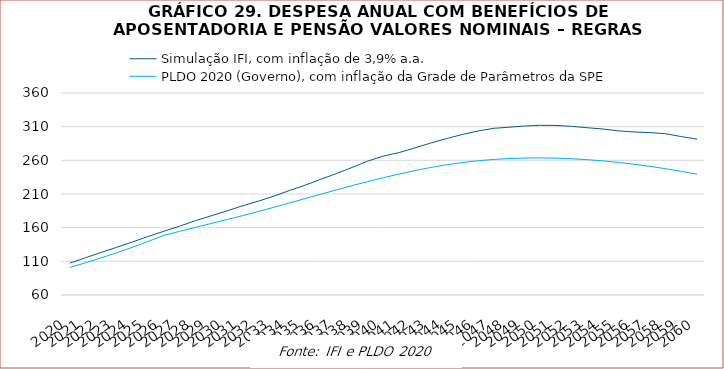
| Category | Simulação IFI, com inflação de 3,9% a.a. | PLDO 2020 (Governo), com inflação da Grade de Parâmetros da SPE |
|---|---|---|
| 2020.0 | 107351899791.775 | 100879070000 |
| 2021.0 | 115361453631.721 | 107879221000 |
| 2022.0 | 123233236311.306 | 115222703000 |
| 2023.0 | 130944334706.833 | 122827494000 |
| 2024.0 | 138782771306.719 | 130947528000 |
| 2025.0 | 146939864227.411 | 139573486000 |
| 2026.0 | 154710650795.586 | 148487649000 |
| 2027.0 | 162195067323.407 | 154557029000 |
| 2028.0 | 170308228547.678 | 160444946000 |
| 2029.0 | 177494018449.356 | 166151333000 |
| 2030.0 | 184768752678.016 | 171958755000 |
| 2031.0 | 192395012955.414 | 177766430000 |
| 2032.0 | 199144826270.896 | 183864323000 |
| 2033.0 | 206795152116.527 | 190169994000 |
| 2034.0 | 215110233084.601 | 196701173000 |
| 2035.0 | 223058993151.744 | 203153802000 |
| 2036.0 | 231825744930.687 | 209658571000 |
| 2037.0 | 240389469108.066 | 216056701000 |
| 2038.0 | 249465721070.328 | 222413553000 |
| 2039.0 | 258890132127.832 | 228466656000 |
| 2040.0 | 266304627676.107 | 234240041000 |
| 2041.0 | 271556692420.097 | 239672494000 |
| 2042.0 | 278440537884.08 | 244803575000 |
| 2043.0 | 285630151806.433 | 249335587000 |
| 2044.0 | 292162833244.225 | 253301853000 |
| 2045.0 | 298268706599.196 | 256567157000 |
| 2046.0 | 303458423956.451 | 259270879000 |
| 2047.0 | 307506100399.14 | 261293861000 |
| 2048.0 | 309186455900.577 | 262637370000 |
| 2049.0 | 310992478969.527 | 263382134000 |
| 2050.0 | 312026936248.327 | 263584230000 |
| 2051.0 | 311787588155.472 | 263234388000 |
| 2052.0 | 310451485959.058 | 262368464000 |
| 2053.0 | 308398865205.613 | 260985172000 |
| 2054.0 | 306497415399.598 | 259135300000 |
| 2055.0 | 303694773924.38 | 256844353000 |
| 2056.0 | 302085832355.08 | 254132622000 |
| 2057.0 | 301186696427.959 | 251016505000 |
| 2058.0 | 299443821450.64 | 247504735000 |
| 2059.0 | 295206115747.378 | 243600667000 |
| 2060.0 | 291441686234.671 | 239307169000 |